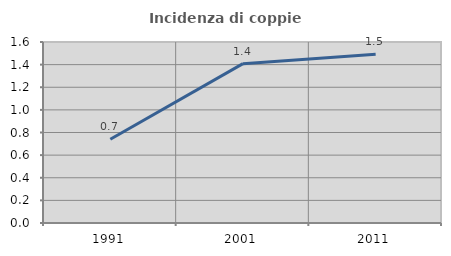
| Category | Incidenza di coppie miste |
|---|---|
| 1991.0 | 0.741 |
| 2001.0 | 1.408 |
| 2011.0 | 1.493 |